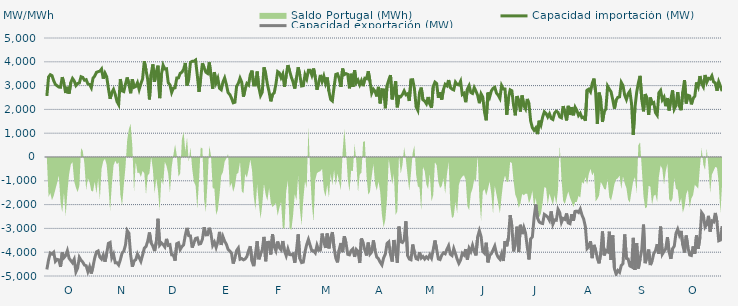
| Category | Capacidad importación (MW) | Capacidad exportación (MW) |
|---|---|---|
| 0 | 2563.833 | -4725 |
| 1900-01-01 | 3360 | -4325.625 |
| 1900-01-02 | 3457.5 | -4035 |
| 1900-01-03 | 3420 | -4078.125 |
| 1900-01-04 | 3202.5 | -4005 |
| 1900-01-05 | 3050.625 | -4383.75 |
| 1900-01-06 | 2992.5 | -4301.25 |
| 1900-01-07 | 2938.125 | -4320 |
| 1900-01-08 | 2928.75 | -4614.375 |
| 1900-01-09 | 3356.25 | -4010.625 |
| 1900-01-10 | 3093.75 | -4231.875 |
| 1900-01-11 | 2686.875 | -4143.75 |
| 1900-01-12 | 2947.5 | -3935.625 |
| 1900-01-13 | 2664.375 | -4254.375 |
| 1900-01-14 | 3127.5 | -4350 |
| 1900-01-15 | 3300 | -4443.75 |
| 1900-01-16 | 3198.542 | -4296 |
| 1900-01-17 | 3001.875 | -4828.125 |
| 1900-01-18 | 3088.125 | -4666.875 |
| 1900-01-19 | 3110.625 | -4215 |
| 1900-01-20 | 3373.125 | -4336.875 |
| 1900-01-21 | 3345 | -4417.5 |
| 1900-01-22 | 3226.875 | -4541.25 |
| 1900-01-23 | 3251.25 | -4569.375 |
| 1900-01-24 | 3069.375 | -4816.875 |
| 1900-01-25 | 3046.875 | -4610.625 |
| 1900-01-26 | 2910 | -4897.5 |
| 1900-01-27 | 3309.375 | -4593.75 |
| 1900-01-28 | 3399.792 | -4243 |
| 1900-01-29 | 3556.875 | -3988.125 |
| 1900-01-30 | 3585.6 | -3948.08 |
| 1900-01-31 | 3605.625 | -4208.542 |
| 1900-02-01 | 3697.5 | -4290 |
| 1900-02-02 | 3291.25 | -4115.625 |
| 1900-02-03 | 3523.125 | -4398.75 |
| 1900-02-04 | 3371.25 | -4055.625 |
| 1900-02-05 | 2883.75 | -3628.125 |
| 1900-02-06 | 2445 | -3590.625 |
| 1900-02-07 | 2711.25 | -4233.75 |
| 1900-02-08 | 2842.292 | -4080 |
| 1900-02-09 | 2631.042 | -4443.75 |
| 1900-02-10 | 2333.542 | -4443.75 |
| 1900-02-11 | 2201.25 | -4537.5 |
| 1900-02-12 | 3275.625 | -4314.375 |
| 1900-02-13 | 2778.75 | -4038.75 |
| 1900-02-14 | 2749.167 | -3955 |
| 1900-02-15 | 3064.375 | -3696.875 |
| 1900-02-16 | 3341.083 | -3091.583 |
| 1900-02-17 | 3070.042 | -3200 |
| 1900-02-18 | 2678.625 | -4117.917 |
| 1900-02-19 | 3264.375 | -4610.625 |
| 1900-02-20 | 2928.75 | -4363.125 |
| 1900-02-21 | 2966.25 | -4316.25 |
| 1900-02-22 | 3121.875 | -4074.375 |
| 1900-02-23 | 2836.875 | -4230 |
| 1900-02-24 | 3078.75 | -4385.625 |
| 1900-02-25 | 3281.25 | -4121.25 |
| 1900-02-26 | 4027.5 | -3836.25 |
| 1900-02-27 | 3646.875 | -3765 |
| 1900-02-28 | 3256.875 | -3536.25 |
| 1900-02-28 | 2419.833 | -3170.625 |
| 1900-03-01 | 3472.5 | -3611.25 |
| 1900-03-02 | 3890.625 | -3742.5 |
| 1900-03-03 | 3166.875 | -3954.375 |
| 1900-03-04 | 3577.5 | -3583.125 |
| 1900-03-05 | 3836 | -2595.625 |
| 1900-03-06 | 2475 | -3700 |
| 1900-03-07 | 3466.875 | -3605.625 |
| 1900-03-08 | 3856.875 | -3676.458 |
| 1900-03-09 | 3697.5 | -3778.125 |
| 1900-03-10 | 3708.75 | -3440.625 |
| 1900-03-11 | 3125.625 | -3712.5 |
| 1900-03-12 | 3026.792 | -3685.625 |
| 1900-03-13 | 2711.458 | -4111.875 |
| 1900-03-14 | 2894.583 | -4117.5 |
| 1900-03-15 | 2908.583 | -4353.75 |
| 1900-03-16 | 3321.875 | -3639.375 |
| 1900-03-17 | 3324.375 | -3603.75 |
| 1900-03-18 | 3515.833 | -3886.875 |
| 1900-03-19 | 3562.5 | -3763.125 |
| 1900-03-20 | 3684.792 | -3688.125 |
| 1900-03-21 | 3950.625 | -3281.25 |
| 1900-03-22 | 3006.042 | -2979.375 |
| 1900-03-23 | 3276.667 | -3305.625 |
| 1900-03-24 | 3978.75 | -3315 |
| 1900-03-25 | 4018.125 | -3806.25 |
| 1900-03-26 | 4020 | -3611.25 |
| 1900-03-27 | 4072.5 | -3421.458 |
| 1900-03-28 | 3435 | -3400.208 |
| 1900-03-29 | 2733.458 | -3658.125 |
| 1900-03-30 | 3328.542 | -3637.5 |
| 1900-03-31 | 3937.5 | -3451.875 |
| 1900-04-01 | 3746.25 | -2948.958 |
| 1900-04-02 | 3564.375 | -3273.75 |
| 1900-04-03 | 3513.75 | -3266.25 |
| 1900-04-04 | 3975 | -2973.75 |
| 1900-04-05 | 3418.125 | -3228.75 |
| 1900-04-06 | 2868.75 | -3712.5 |
| 1900-04-07 | 3568.125 | -3577.5 |
| 1900-04-08 | 3120 | -3802.5 |
| 1900-04-09 | 3305.625 | -3564.375 |
| 1900-04-10 | 2884.375 | -3145.875 |
| 1900-04-11 | 2826.25 | -3695.625 |
| 1900-04-12 | 3149.792 | -3346.875 |
| 1900-04-13 | 3321.458 | -3540 |
| 1900-04-14 | 3048.75 | -3665.625 |
| 1900-04-15 | 2704.25 | -3881.25 |
| 1900-04-16 | 2627.25 | -3950.625 |
| 1900-04-17 | 2475.708 | -4038.75 |
| 1900-04-18 | 2277.917 | -4477.5 |
| 1900-04-19 | 2300 | -4239.375 |
| 1900-04-20 | 2972.708 | -3928.125 |
| 1900-04-21 | 3093.75 | -3825 |
| 1900-04-22 | 3313.333 | -4297.5 |
| 1900-04-23 | 3141.75 | -4268.125 |
| 1900-04-24 | 2533.125 | -4321.875 |
| 1900-04-25 | 2863.375 | -4282.5 |
| 1900-04-26 | 3088.125 | -4185 |
| 1900-04-27 | 3024.375 | -3931.875 |
| 1900-04-28 | 3459.375 | -3751.875 |
| 1900-04-29 | 3630 | -4380 |
| 1900-04-30 | 3020.625 | -4586.25 |
| 1900-05-01 | 3020.625 | -4091.25 |
| 1900-05-02 | 3592.5 | -3540 |
| 1900-05-03 | 2925 | -4297.5 |
| 1900-05-04 | 2582.625 | -4080.542 |
| 1900-05-05 | 2730 | -3900.625 |
| 1900-05-06 | 3769.167 | -3357.25 |
| 1900-05-07 | 3498.625 | -4380 |
| 1900-05-08 | 3058.125 | -3591.583 |
| 1900-05-09 | 2735.625 | -3581.875 |
| 1900-05-10 | 2339.792 | -4096.875 |
| 1900-05-11 | 2622.625 | -3250.667 |
| 1900-05-12 | 2697.5 | -3770.625 |
| 1900-05-13 | 3064.167 | -3943.625 |
| 1900-05-14 | 3588.75 | -3549.375 |
| 1900-05-15 | 3535.75 | -3810 |
| 1900-05-16 | 3333.958 | -3898.125 |
| 1900-05-17 | 3486.625 | -3530.542 |
| 1900-05-18 | 2951.375 | -3943.125 |
| 1900-05-19 | 3439.375 | -4149.375 |
| 1900-05-20 | 3860.625 | -3864.375 |
| 1900-05-21 | 3609.583 | -4100.625 |
| 1900-05-22 | 3359.75 | -4110 |
| 1900-05-23 | 3152.25 | -4073.75 |
| 1900-05-24 | 2876.25 | -4441.875 |
| 1900-05-25 | 3331.25 | -3948.75 |
| 1900-05-26 | 3768.75 | -3251.25 |
| 1900-05-27 | 3435.667 | -4269.375 |
| 1900-05-28 | 2984.167 | -4438.125 |
| 1900-05-29 | 2998.583 | -4415.625 |
| 1900-05-30 | 3457.333 | -3980.625 |
| 1900-05-31 | 3283.042 | -3676.875 |
| 1900-06-01 | 3641.25 | -3464.5 |
| 1900-06-02 | 3640.708 | -3708.75 |
| 1900-06-03 | 3435.708 | -3937.5 |
| 1900-06-04 | 3718.125 | -3943.125 |
| 1900-06-05 | 3344.458 | -4031.25 |
| 1900-06-06 | 2827.083 | -3710.625 |
| 1900-06-07 | 3113.75 | -3920.625 |
| 1900-06-08 | 3448.125 | -3913.125 |
| 1900-06-09 | 3172.083 | -3219.375 |
| 1900-06-10 | 3397.5 | -3562.5 |
| 1900-06-11 | 3101.042 | -3819.375 |
| 1900-06-12 | 3341.25 | -3215.625 |
| 1900-06-13 | 2760.833 | -3838.125 |
| 1900-06-14 | 2417.5 | -3395.625 |
| 1900-06-15 | 2354.583 | -3155.625 |
| 1900-06-16 | 2936.875 | -3811.875 |
| 1900-06-17 | 3468.75 | -4241.25 |
| 1900-06-18 | 3495 | -4426.875 |
| 1900-06-19 | 3297.083 | -3890.625 |
| 1900-06-20 | 2946.292 | -3613.125 |
| 1900-06-21 | 3714.792 | -3997.5 |
| 1900-06-22 | 3460.833 | -3331.875 |
| 1900-06-23 | 3502.917 | -3618.5 |
| 1900-06-24 | 3472.5 | -4089.375 |
| 1900-06-25 | 2885.87 | -4111.304 |
| 1900-06-26 | 3496.875 | -3930 |
| 1900-06-27 | 2942.5 | -3858.75 |
| 1900-06-28 | 3650.625 | -4194.375 |
| 1900-06-29 | 3122.458 | -3885 |
| 1900-06-30 | 3230.042 | -3961.875 |
| 1900-07-01 | 3034.208 | -4453.125 |
| 1900-07-02 | 3206.25 | -3423.75 |
| 1900-07-03 | 2977.5 | -3611.25 |
| 1900-07-04 | 3309.375 | -3911.25 |
| 1900-07-05 | 3288.75 | -4138.125 |
| 1900-07-06 | 3602.833 | -3596.25 |
| 1900-07-07 | 3174.375 | -4080 |
| 1900-07-08 | 2683.667 | -3991.875 |
| 1900-07-09 | 2848.875 | -3504.833 |
| 1900-07-10 | 2758.542 | -3938.333 |
| 1900-07-11 | 2545.417 | -4209.375 |
| 1900-07-12 | 2945.625 | -4278.75 |
| 1900-07-13 | 2252.5 | -4423.125 |
| 1900-07-14 | 2829.375 | -4533.75 |
| 1900-07-15 | 2820.917 | -4235.625 |
| 1900-07-16 | 2048.125 | -4081.208 |
| 1900-07-17 | 3003.75 | -3632.292 |
| 1900-07-18 | 3232.5 | -3565.625 |
| 1900-07-19 | 3440.625 | -4096.875 |
| 1900-07-20 | 2422.5 | -4393.125 |
| 1900-07-21 | 2763.958 | -3487.5 |
| 1900-07-22 | 3183.75 | -3943.125 |
| 1900-07-23 | 2087.083 | -4443.75 |
| 1900-07-24 | 2547 | -2925.75 |
| 1900-07-25 | 2531.667 | -3560.625 |
| 1900-07-26 | 2628.75 | -3590.625 |
| 1900-07-27 | 2778.75 | -3480 |
| 1900-07-28 | 2617.292 | -2701.792 |
| 1900-07-29 | 2655 | -4141.875 |
| 1900-07-30 | 2355.417 | -4288.125 |
| 1900-07-31 | 3240.75 | -4318.125 |
| 1900-08-01 | 3247.5 | -3676.875 |
| 1900-08-02 | 2878.042 | -4025.625 |
| 1900-08-03 | 2109.167 | -4269.375 |
| 1900-08-04 | 1961.042 | -4299.375 |
| 1900-08-05 | 2710.208 | -4003.125 |
| 1900-08-06 | 2916 | -4248.333 |
| 1900-08-07 | 2401.875 | -4179.375 |
| 1900-08-08 | 2351.25 | -4286.25 |
| 1900-08-09 | 2238.75 | -4192.5 |
| 1900-08-10 | 2520 | -4265.625 |
| 1900-08-11 | 2227.5 | -4108.125 |
| 1900-08-12 | 2070.583 | -4246.875 |
| 1900-08-13 | 2958.75 | -3892.5 |
| 1900-08-14 | 3146.25 | -3508.125 |
| 1900-08-15 | 3087.5 | -3877.5 |
| 1900-08-16 | 2487.5 | -4284.375 |
| 1900-08-17 | 2722.5 | -4310.625 |
| 1900-08-18 | 2411.25 | -4125 |
| 1900-08-19 | 2840.5 | -4025.625 |
| 1900-08-20 | 3054.5 | -4066.875 |
| 1900-08-21 | 2992.958 | -3879.375 |
| 1900-08-22 | 3232.5 | -3729.375 |
| 1900-08-23 | 2917.5 | -4085.625 |
| 1900-08-24 | 2853.75 | -4141.875 |
| 1900-08-25 | 2819.458 | -3849.375 |
| 1900-08-26 | 3145.042 | -4061.25 |
| 1900-08-27 | 3046.958 | -4290 |
| 1900-08-28 | 3028.125 | -4468.125 |
| 1900-08-29 | 3180.542 | -4331.25 |
| 1900-08-30 | 2624.958 | -4042.5 |
| 1900-08-31 | 2676.25 | -4115.625 |
| 1900-09-01 | 2302.5 | -3873.75 |
| 1900-09-02 | 2854.208 | -4308.75 |
| 1900-09-03 | 2997.833 | -3837.167 |
| 1900-09-04 | 2709.375 | -3973.125 |
| 1900-09-05 | 2670 | -3712.958 |
| 1900-09-06 | 2913.75 | -3958.125 |
| 1900-09-07 | 2765.625 | -4134.375 |
| 1900-09-08 | 2587.5 | -3352.5 |
| 1900-09-09 | 2261.25 | -3093.75 |
| 1900-09-10 | 2651.25 | -3345.208 |
| 1900-09-11 | 2510.625 | -3963.75 |
| 1900-09-12 | 1885.875 | -4044.375 |
| 1900-09-13 | 1541.5 | -3601.375 |
| 1900-09-14 | 2707.5 | -4426.875 |
| 1900-09-15 | 2516.25 | -4128.75 |
| 1900-09-16 | 2775 | -4059.375 |
| 1900-09-17 | 2883.75 | -3906.667 |
| 1900-09-18 | 2930.625 | -3742.5 |
| 1900-09-19 | 2685 | -4061.25 |
| 1900-09-20 | 2596.875 | -4213.125 |
| 1900-09-21 | 2463.75 | -4295.625 |
| 1900-09-22 | 3005.625 | -4065 |
| 1900-09-23 | 2861.25 | -4370.625 |
| 1900-09-24 | 2855.083 | -3533.583 |
| 1900-09-25 | 1775.625 | -3751.875 |
| 1900-09-26 | 2478.75 | -3391.875 |
| 1900-09-27 | 2821.875 | -2444.375 |
| 1900-09-28 | 2782.5 | -2903.75 |
| 1900-09-29 | 2169.375 | -3964.667 |
| 1900-09-30 | 1751.292 | -3614.625 |
| 1900-10-01 | 2561.25 | -2926.875 |
| 1900-10-02 | 2356.875 | -3995.625 |
| 1900-10-03 | 1911.125 | -2849.625 |
| 1900-10-04 | 2583.75 | -3240 |
| 1900-10-05 | 2157.125 | -2962.917 |
| 1900-10-06 | 2021.375 | -3195.625 |
| 1900-10-07 | 2439.375 | -3776.25 |
| 1900-10-08 | 2235 | -4305 |
| 1900-10-09 | 1509.375 | -3436.875 |
| 1900-10-10 | 1230.208 | -3360 |
| 1900-10-11 | 1123.125 | -2546.875 |
| 1900-10-12 | 1221.25 | -1995.875 |
| 1900-10-13 | 962.083 | -2563.125 |
| 1900-10-14 | 1523.958 | -2728.125 |
| 1900-10-15 | 1344.375 | -2776.875 |
| 1900-10-16 | 1676.25 | -2795.625 |
| 1900-10-17 | 1899.375 | -2411.25 |
| 1900-10-18 | 1826.25 | -2461.875 |
| 1900-10-19 | 1680 | -2529.375 |
| 1900-10-20 | 1815 | -2662.5 |
| 1900-10-21 | 1621.458 | -2287.5 |
| 1900-10-22 | 1577.083 | -2818.125 |
| 1900-10-23 | 1846.875 | -2643.75 |
| 1900-10-24 | 1923.75 | -2656.875 |
| 1900-10-25 | 1875 | -2195.625 |
| 1900-10-26 | 1683.75 | -2330.625 |
| 1900-10-27 | 1646.25 | -2746.875 |
| 1900-10-28 | 2137.5 | -2580.5 |
| 1900-10-29 | 1860 | -2620.625 |
| 1900-10-30 | 1537.5 | -2371.875 |
| 1900-10-31 | 2149.292 | -2771.25 |
| 1900-11-01 | 1766.25 | -2801.25 |
| 1900-11-02 | 2097.75 | -2405.625 |
| 1900-11-03 | 1753.125 | -2676.75 |
| 1900-11-04 | 2090.625 | -2285.292 |
| 1900-11-05 | 1956.125 | -2274.75 |
| 1900-11-06 | 1743.75 | -2330.125 |
| 1900-11-07 | 1833.75 | -2185.875 |
| 1900-11-08 | 1651.875 | -2439.375 |
| 1900-11-09 | 1677 | -2608.125 |
| 1900-11-10 | 1526.25 | -2926.875 |
| 1900-11-11 | 2806.875 | -3847.5 |
| 1900-11-12 | 2853.75 | -3770.625 |
| 1900-11-13 | 2739.375 | -3542.5 |
| 1900-11-14 | 3086.25 | -4248.75 |
| 1900-11-15 | 3294.375 | -3694.583 |
| 1900-11-16 | 2737.5 | -3914.167 |
| 1900-11-17 | 1388.958 | -4258.125 |
| 1900-11-18 | 2705.625 | -4468.125 |
| 1900-11-19 | 2414.25 | -4032.292 |
| 1900-11-20 | 1474.5 | -3127.5 |
| 1900-11-21 | 1904.833 | -4134.375 |
| 1900-11-22 | 2018.333 | -3933.75 |
| 1900-11-23 | 2978.625 | -3980.625 |
| 1900-11-24 | 2851.875 | -3137.917 |
| 1900-11-25 | 2745 | -4327.5 |
| 1900-11-26 | 2411.25 | -3294.375 |
| 1900-11-27 | 2032.5 | -4693.125 |
| 1900-11-28 | 2394.375 | -4916.25 |
| 1900-11-29 | 2506.875 | -4770 |
| 1900-11-30 | 2527.5 | -4845 |
| 1900-12-01 | 3132.875 | -4556.25 |
| 1900-12-02 | 3001.875 | -4479.375 |
| 1900-12-03 | 2597 | -3253.75 |
| 1900-12-04 | 2415.833 | -4258.125 |
| 1900-12-05 | 2655 | -4284.375 |
| 1900-12-06 | 2764.458 | -4576.875 |
| 1900-12-07 | 2248.625 | -4616.25 |
| 1900-12-08 | 931.875 | -3396.042 |
| 1900-12-09 | 2074.792 | -4740 |
| 1900-12-10 | 2707.5 | -3624.375 |
| 1900-12-11 | 3118.125 | -4681.875 |
| 1900-12-12 | 3408.75 | -4280.625 |
| 1900-12-13 | 2415 | -3889.583 |
| 1900-12-14 | 1918.917 | -2840.25 |
| 1900-12-15 | 2645.125 | -4460.625 |
| 1900-12-16 | 2469.792 | -4186.875 |
| 1900-12-17 | 1772.542 | -3887.917 |
| 1900-12-18 | 2498.667 | -4538.125 |
| 1900-12-19 | 2245.542 | -4370 |
| 1900-12-20 | 2285.625 | -4056.25 |
| 1900-12-21 | 1862.708 | -3941.667 |
| 1900-12-22 | 1755.417 | -3663.125 |
| 1900-12-23 | 2699.583 | -4063.125 |
| 1900-12-24 | 2797.5 | -2925.625 |
| 1900-12-25 | 2403.333 | -4085.625 |
| 1900-12-26 | 2516.25 | -3971.25 |
| 1900-12-27 | 2135.625 | -3854.792 |
| 1900-12-28 | 2477.125 | -3369.292 |
| 1900-12-29 | 1956.292 | -3999.375 |
| 1900-12-30 | 2427.5 | -4280 |
| 1900-12-31 | 2798 | -3856.875 |
| 1901-01-01 | 2018.125 | -3744.583 |
| 1901-01-02 | 2168.958 | -3208.75 |
| 1901-01-03 | 2728.125 | -3034.375 |
| 1901-01-04 | 2131.75 | -3278.125 |
| 1901-01-05 | 1966.875 | -3106.458 |
| 1901-01-06 | 2738.083 | -3703.375 |
| 1901-01-07 | 3229.167 | -4012.5 |
| 1901-01-08 | 2249.792 | -3300.833 |
| 1901-01-09 | 2592.917 | -3809.792 |
| 1901-01-10 | 2566.25 | -4116.667 |
| 1901-01-11 | 2212.5 | -4138.708 |
| 1901-01-12 | 2464.375 | -3755.833 |
| 1901-01-13 | 2551.042 | -4061.25 |
| 1901-01-14 | 3133.5 | -3295.833 |
| 1901-01-15 | 2953.75 | -3854.167 |
| 1901-01-16 | 3401.25 | -3375.917 |
| 1901-01-17 | 3082.5 | -2336.25 |
| 1901-01-18 | 2949.375 | -2439.375 |
| 1901-01-19 | 3446.25 | -2947.5 |
| 1901-01-20 | 3138.75 | -2840.625 |
| 1901-01-21 | 3305 | -2472.958 |
| 1901-01-22 | 3276.125 | -3134.625 |
| 1901-01-23 | 3410.625 | -2685.417 |
| 1901-01-24 | 3153.75 | -2727.292 |
| 1901-01-25 | 3110.625 | -2351.25 |
| 1901-01-26 | 2786.458 | -2737.5 |
| 1901-01-27 | 3159.375 | -3519.375 |
| 1901-01-28 | 2974.6 | -3488.4 |
| 1901-01-29 | 2766.667 | -2906.917 |